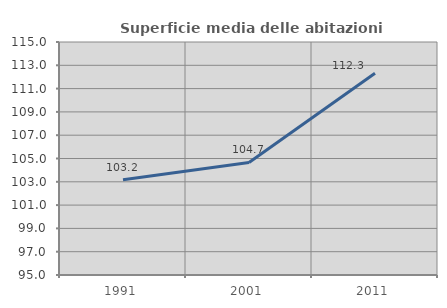
| Category | Superficie media delle abitazioni occupate |
|---|---|
| 1991.0 | 103.182 |
| 2001.0 | 104.664 |
| 2011.0 | 112.31 |